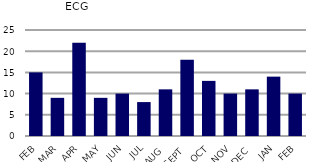
| Category | ECG |
|---|---|
| FEB | 15 |
| MAR | 9 |
| APR | 22 |
| MAY | 9 |
| JUN | 10 |
| JUL | 8 |
| AUG | 11 |
| SEPT | 18 |
| OCT | 13 |
| NOV | 10 |
| DEC | 11 |
| JAN | 14 |
| FEB | 10 |